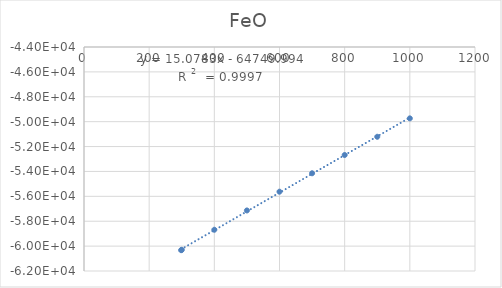
| Category | Series 0 |
|---|---|
| 298.15 | -60327.8 |
| 300.0 | -60297.3 |
| 400.0 | -58685.3 |
| 500.0 | -57134.7 |
| 600.0 | -55627 |
| 700.0 | -54146.7 |
| 800.0 | -52679.9 |
| 900.0 | -51213.9 |
| 1000.0 | -49734.5 |